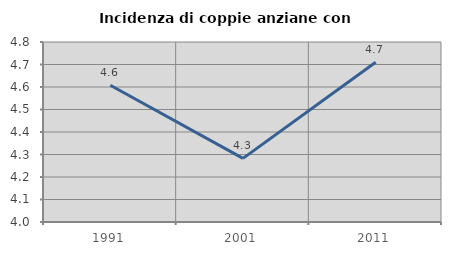
| Category | Incidenza di coppie anziane con figli |
|---|---|
| 1991.0 | 4.608 |
| 2001.0 | 4.283 |
| 2011.0 | 4.71 |